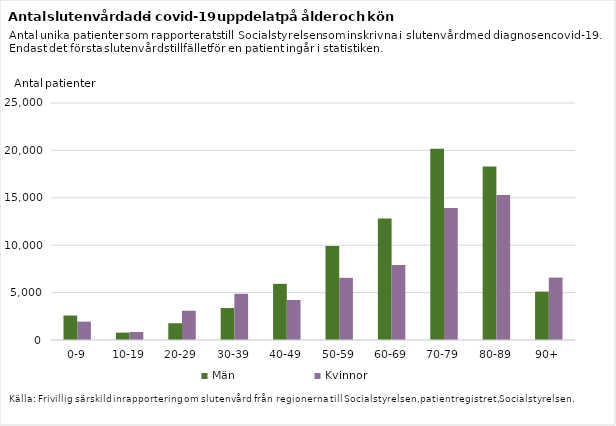
| Category | Män | Kvinnor |
|---|---|---|
| 0-9 | 2581 | 1936 |
| 10-19 | 777 | 842 |
| 20-29 | 1768 | 3086 |
| 30-39 | 3372 | 4873 |
| 40-49 | 5925 | 4217 |
| 50-59 | 9924 | 6558 |
| 60-69 | 12822 | 7914 |
| 70-79 | 20163 | 13937 |
| 80-89 | 18305 | 15305 |
| 90+ | 5105 | 6580 |